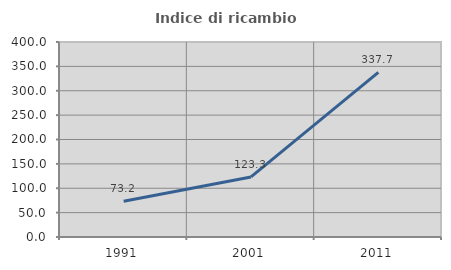
| Category | Indice di ricambio occupazionale  |
|---|---|
| 1991.0 | 73.206 |
| 2001.0 | 123.266 |
| 2011.0 | 337.705 |